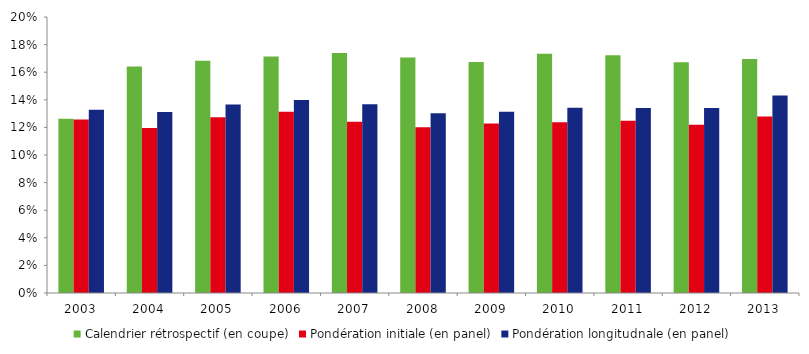
| Category | Calendrier rétrospectif (en coupe) | Pondération initiale (en panel) | Pondération longitudnale (en panel) |
|---|---|---|---|
| 2003.0 | 0.126 | 0.126 | 0.133 |
| 2004.0 | 0.164 | 0.12 | 0.131 |
| 2005.0 | 0.168 | 0.127 | 0.137 |
| 2006.0 | 0.171 | 0.131 | 0.14 |
| 2007.0 | 0.174 | 0.124 | 0.137 |
| 2008.0 | 0.171 | 0.12 | 0.13 |
| 2009.0 | 0.167 | 0.123 | 0.131 |
| 2010.0 | 0.173 | 0.124 | 0.134 |
| 2011.0 | 0.172 | 0.125 | 0.134 |
| 2012.0 | 0.167 | 0.122 | 0.134 |
| 2013.0 | 0.17 | 0.128 | 0.143 |